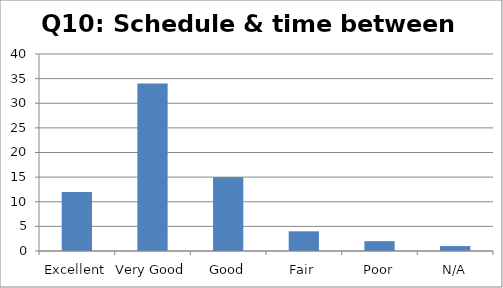
| Category | Response count |
|---|---|
| Excellent | 12 |
| Very Good | 34 |
| Good | 15 |
| Fair | 4 |
| Poor | 2 |
| N/A | 1 |